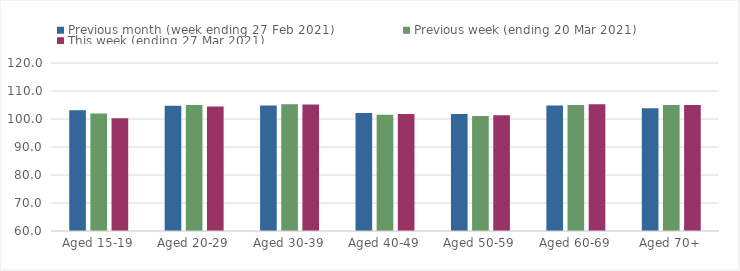
| Category | Previous month (week ending 27 Feb 2021) | Previous week (ending 20 Mar 2021) | This week (ending 27 Mar 2021) |
|---|---|---|---|
| Aged 15-19 | 103.16 | 101.93 | 100.28 |
| Aged 20-29 | 104.69 | 105.01 | 104.43 |
| Aged 30-39 | 104.83 | 105.26 | 105.17 |
| Aged 40-49 | 102.15 | 101.52 | 101.77 |
| Aged 50-59 | 101.75 | 101.03 | 101.36 |
| Aged 60-69 | 104.79 | 104.98 | 105.25 |
| Aged 70+ | 103.83 | 104.96 | 105.02 |